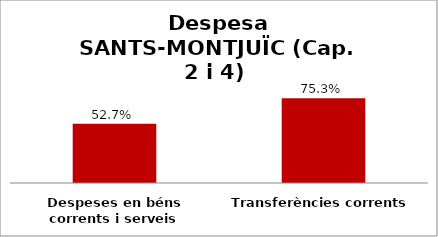
| Category | Series 0 |
|---|---|
| Despeses en béns corrents i serveis | 0.527 |
| Transferències corrents | 0.753 |